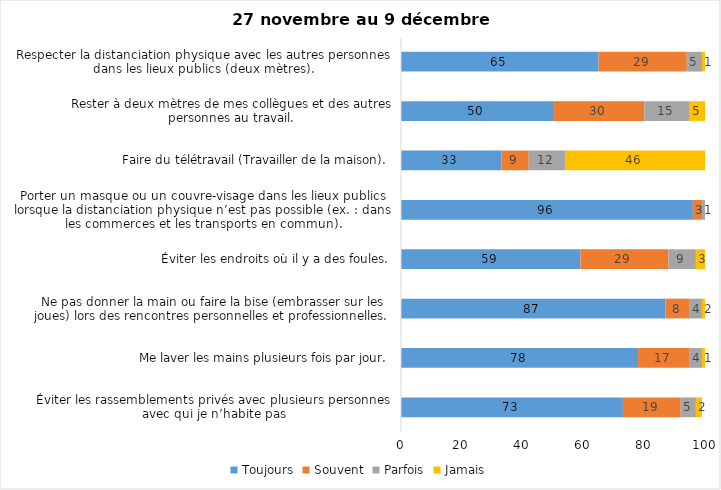
| Category | Toujours | Souvent | Parfois | Jamais |
|---|---|---|---|---|
| Éviter les rassemblements privés avec plusieurs personnes avec qui je n’habite pas | 73 | 19 | 5 | 2 |
| Me laver les mains plusieurs fois par jour. | 78 | 17 | 4 | 1 |
| Ne pas donner la main ou faire la bise (embrasser sur les joues) lors des rencontres personnelles et professionnelles. | 87 | 8 | 4 | 2 |
| Éviter les endroits où il y a des foules. | 59 | 29 | 9 | 3 |
| Porter un masque ou un couvre-visage dans les lieux publics lorsque la distanciation physique n’est pas possible (ex. : dans les commerces et les transports en commun). | 96 | 3 | 1 | 0 |
| Faire du télétravail (Travailler de la maison). | 33 | 9 | 12 | 46 |
| Rester à deux mètres de mes collègues et des autres personnes au travail. | 50 | 30 | 15 | 5 |
| Respecter la distanciation physique avec les autres personnes dans les lieux publics (deux mètres). | 65 | 29 | 5 | 1 |